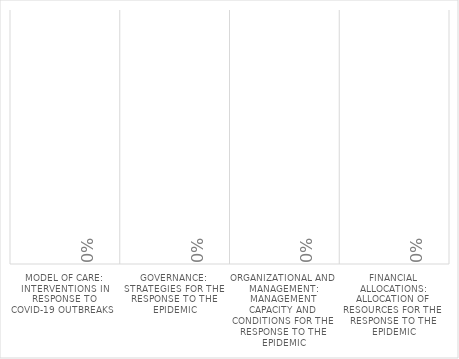
| Category | Series 0 | Series 1 | Series 2 |
|---|---|---|---|
| Model of Care: Interventions in response to COVID-19 outbreaks  |  |  | 0 |
| Governance: Strategies for the Response to the epidemic |  |  | 0 |
| Organizational and Management: Management capacity and conditions for the response to the epidemic |  |  | 0 |
| Financial Allocations: Allocation of resources for the response to the epidemic |  |  | 0 |